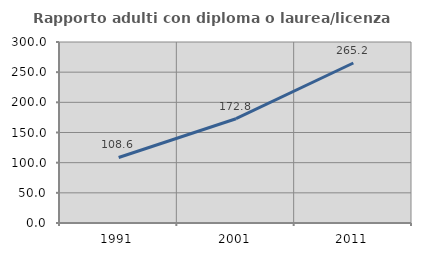
| Category | Rapporto adulti con diploma o laurea/licenza media  |
|---|---|
| 1991.0 | 108.632 |
| 2001.0 | 172.836 |
| 2011.0 | 265.194 |